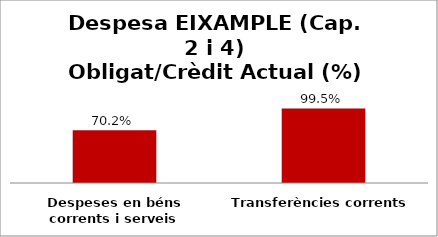
| Category | Series 0 |
|---|---|
| Despeses en béns corrents i serveis | 0.702 |
| Transferències corrents | 0.995 |